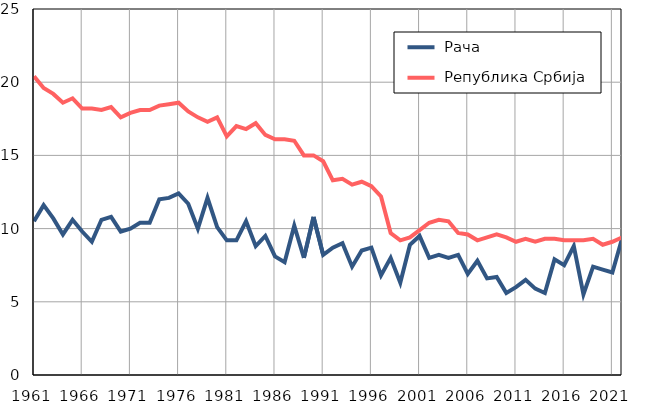
| Category |  Рача |  Република Србија |
|---|---|---|
| 1961.0 | 10.5 | 20.4 |
| 1962.0 | 11.6 | 19.6 |
| 1963.0 | 10.7 | 19.2 |
| 1964.0 | 9.6 | 18.6 |
| 1965.0 | 10.6 | 18.9 |
| 1966.0 | 9.8 | 18.2 |
| 1967.0 | 9.1 | 18.2 |
| 1968.0 | 10.6 | 18.1 |
| 1969.0 | 10.8 | 18.3 |
| 1970.0 | 9.8 | 17.6 |
| 1971.0 | 10 | 17.9 |
| 1972.0 | 10.4 | 18.1 |
| 1973.0 | 10.4 | 18.1 |
| 1974.0 | 12 | 18.4 |
| 1975.0 | 12.1 | 18.5 |
| 1976.0 | 12.4 | 18.6 |
| 1977.0 | 11.7 | 18 |
| 1978.0 | 10 | 17.6 |
| 1979.0 | 12.1 | 17.3 |
| 1980.0 | 10.1 | 17.6 |
| 1981.0 | 9.2 | 16.3 |
| 1982.0 | 9.2 | 17 |
| 1983.0 | 10.5 | 16.8 |
| 1984.0 | 8.8 | 17.2 |
| 1985.0 | 9.5 | 16.4 |
| 1986.0 | 8.1 | 16.1 |
| 1987.0 | 7.7 | 16.1 |
| 1988.0 | 10.2 | 16 |
| 1989.0 | 8 | 15 |
| 1990.0 | 10.8 | 15 |
| 1991.0 | 8.2 | 14.6 |
| 1992.0 | 8.7 | 13.3 |
| 1993.0 | 9 | 13.4 |
| 1994.0 | 7.4 | 13 |
| 1995.0 | 8.5 | 13.2 |
| 1996.0 | 8.7 | 12.9 |
| 1997.0 | 6.8 | 12.2 |
| 1998.0 | 8 | 9.7 |
| 1999.0 | 6.3 | 9.2 |
| 2000.0 | 8.9 | 9.4 |
| 2001.0 | 9.5 | 9.9 |
| 2002.0 | 8 | 10.4 |
| 2003.0 | 8.2 | 10.6 |
| 2004.0 | 8 | 10.5 |
| 2005.0 | 8.2 | 9.7 |
| 2006.0 | 6.9 | 9.6 |
| 2007.0 | 7.8 | 9.2 |
| 2008.0 | 6.6 | 9.4 |
| 2009.0 | 6.7 | 9.6 |
| 2010.0 | 5.6 | 9.4 |
| 2011.0 | 6 | 9.1 |
| 2012.0 | 6.5 | 9.3 |
| 2013.0 | 5.9 | 9.1 |
| 2014.0 | 5.6 | 9.3 |
| 2015.0 | 7.9 | 9.3 |
| 2016.0 | 7.5 | 9.2 |
| 2017.0 | 8.8 | 9.2 |
| 2018.0 | 5.5 | 9.2 |
| 2019.0 | 7.4 | 9.3 |
| 2020.0 | 7.2 | 8.9 |
| 2021.0 | 7 | 9.1 |
| 2022.0 | 9.3 | 9.4 |